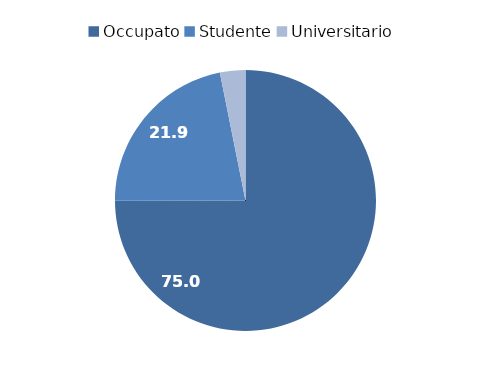
| Category | numerosità |
|---|---|
| Occupato | 74.971 |
| Studente | 21.877 |
| Universitario | 3.152 |